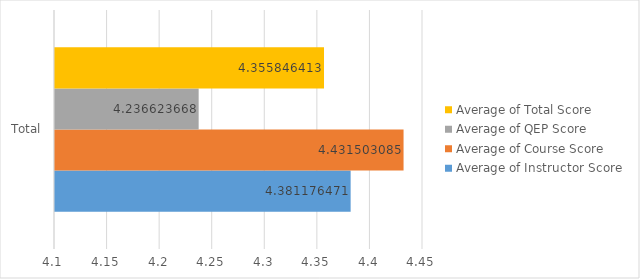
| Category | Average of Instructor Score | Average of Course Score | Average of QEP Score | Average of Total Score |
|---|---|---|---|---|
| Total | 4.381 | 4.432 | 4.237 | 4.356 |